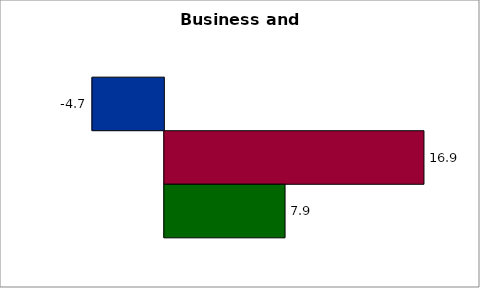
| Category | 50 states and D.C. | SREB states | State |
|---|---|---|---|
| 0 | -4.686 | 16.932 | 7.873 |